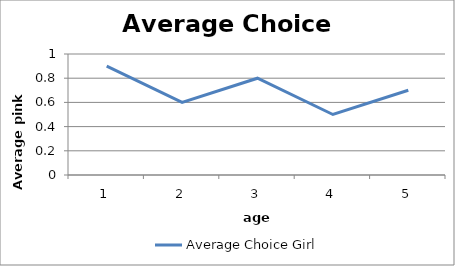
| Category | Average Choice Girl |
|---|---|
| 0 | 0.9 |
| 1 | 0.6 |
| 2 | 0.8 |
| 3 | 0.5 |
| 4 | 0.7 |